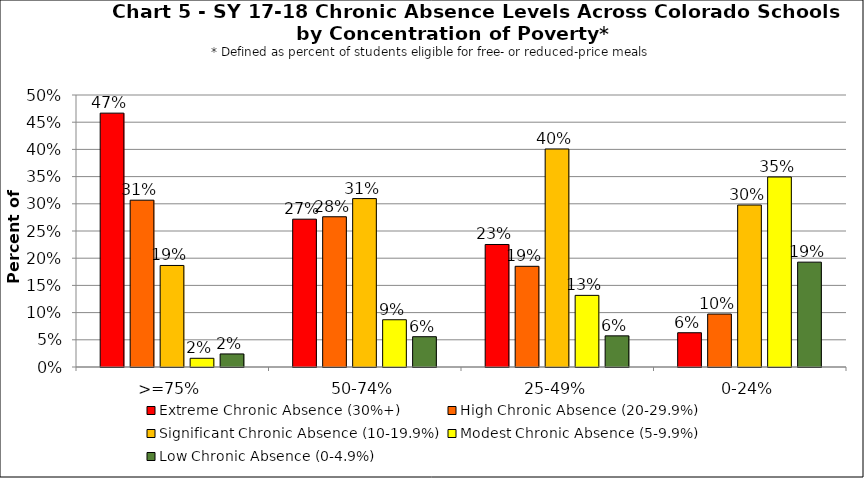
| Category | Extreme Chronic Absence (30%+) | High Chronic Absence (20-29.9%) | Significant Chronic Absence (10-19.9%) | Modest Chronic Absence (5-9.9%) | Low Chronic Absence (0-4.9%) |
|---|---|---|---|---|---|
| 0 | 0.467 | 0.307 | 0.187 | 0.016 | 0.024 |
| 1 | 0.272 | 0.276 | 0.31 | 0.087 | 0.056 |
| 2 | 0.225 | 0.185 | 0.401 | 0.132 | 0.057 |
| 3 | 0.063 | 0.097 | 0.298 | 0.349 | 0.193 |